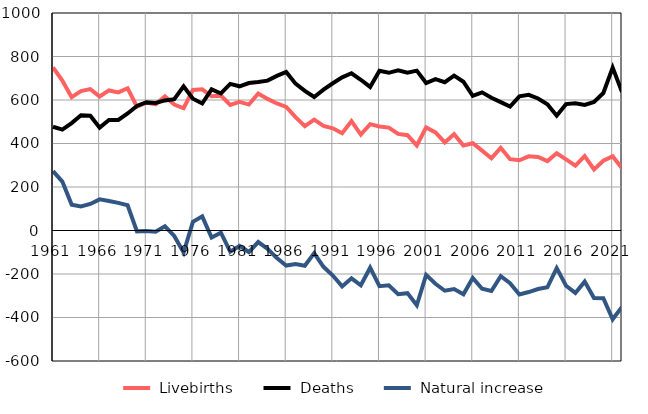
| Category |  Livebirths |  Deaths |  Natural increase |
|---|---|---|---|
| 1961.0 | 750 | 477 | 273 |
| 1962.0 | 689 | 464 | 225 |
| 1963.0 | 613 | 494 | 119 |
| 1964.0 | 641 | 530 | 111 |
| 1965.0 | 650 | 528 | 122 |
| 1966.0 | 616 | 473 | 143 |
| 1967.0 | 644 | 508 | 136 |
| 1968.0 | 635 | 508 | 127 |
| 1969.0 | 654 | 538 | 116 |
| 1970.0 | 569 | 573 | -4 |
| 1971.0 | 588 | 590 | -2 |
| 1972.0 | 580 | 586 | -6 |
| 1973.0 | 617 | 598 | 19 |
| 1974.0 | 579 | 604 | -25 |
| 1975.0 | 562 | 663 | -101 |
| 1976.0 | 646 | 606 | 40 |
| 1977.0 | 649 | 584 | 65 |
| 1978.0 | 617 | 649 | -32 |
| 1979.0 | 620 | 630 | -10 |
| 1980.0 | 577 | 674 | -97 |
| 1981.0 | 592 | 663 | -71 |
| 1982.0 | 579 | 678 | -99 |
| 1983.0 | 630 | 683 | -53 |
| 1984.0 | 605 | 689 | -84 |
| 1985.0 | 584 | 711 | -127 |
| 1986.0 | 568 | 729 | -161 |
| 1987.0 | 521 | 675 | -154 |
| 1988.0 | 480 | 642 | -162 |
| 1989.0 | 510 | 614 | -104 |
| 1990.0 | 481 | 648 | -167 |
| 1991.0 | 470 | 677 | -207 |
| 1992.0 | 447 | 704 | -257 |
| 1993.0 | 503 | 723 | -220 |
| 1994.0 | 441 | 693 | -252 |
| 1995.0 | 489 | 660 | -171 |
| 1996.0 | 478 | 734 | -256 |
| 1997.0 | 473 | 725 | -252 |
| 1998.0 | 444 | 737 | -293 |
| 1999.0 | 438 | 726 | -288 |
| 2000.0 | 391 | 735 | -344 |
| 2001.0 | 474 | 678 | -204 |
| 2002.0 | 451 | 696 | -245 |
| 2003.0 | 405 | 682 | -277 |
| 2004.0 | 443 | 712 | -269 |
| 2005.0 | 391 | 684 | -293 |
| 2006.0 | 401 | 619 | -218 |
| 2007.0 | 367 | 635 | -268 |
| 2008.0 | 332 | 610 | -278 |
| 2009.0 | 380 | 590 | -210 |
| 2010.0 | 328 | 570 | -242 |
| 2011.0 | 323 | 617 | -294 |
| 2012.0 | 341 | 624 | -283 |
| 2013.0 | 338 | 607 | -269 |
| 2014.0 | 319 | 580 | -261 |
| 2015.0 | 355 | 528 | -173 |
| 2016.0 | 327 | 581 | -254 |
| 2017.0 | 298 | 585 | -287 |
| 2018.0 | 342 | 577 | -235 |
| 2019.0 | 281 | 591 | -310 |
| 2020.0 | 321 | 632 | -311 |
| 2021.0 | 341 | 749 | -408 |
| 2022.0 | 286 | 637 | -351 |